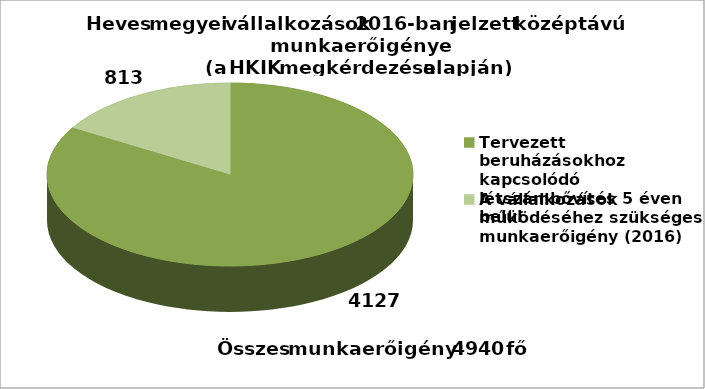
| Category | Series 0 |
|---|---|
| Tervezett beruházásokhoz kapcsolódó létszámbővítés 5 éven belül | 4127 |
| A vállalkozások működéséhez szükséges munkaerőigény (2016) | 813 |